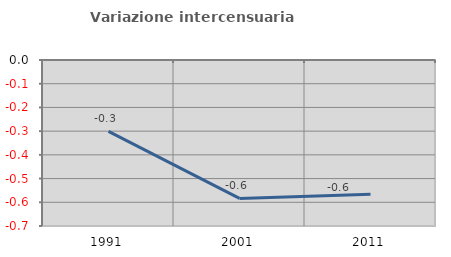
| Category | Variazione intercensuaria annua |
|---|---|
| 1991.0 | -0.301 |
| 2001.0 | -0.584 |
| 2011.0 | -0.566 |